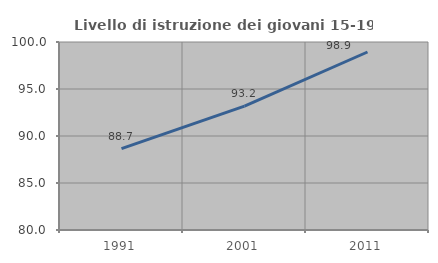
| Category | Livello di istruzione dei giovani 15-19 anni |
|---|---|
| 1991.0 | 88.652 |
| 2001.0 | 93.182 |
| 2011.0 | 98.936 |